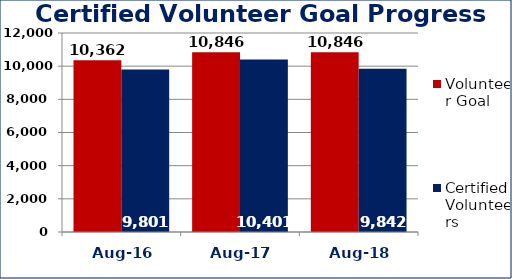
| Category | Volunteer Goal  | Certified Volunteers  |
|---|---|---|
| Aug-16 | 10362 | 9801 |
| Aug-17 | 10846 | 10401 |
| Aug-18 | 10846 | 9842 |